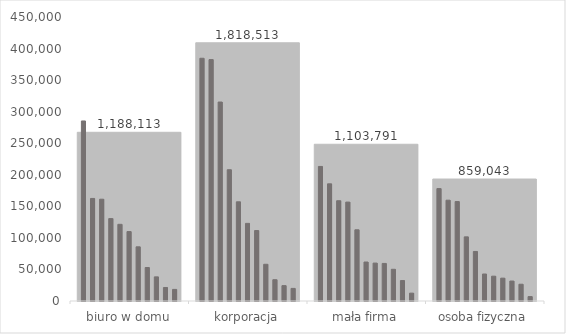
| Category | Total |
|---|---|
| biuro w domu | 1188113.347 |
| korporacja | 1818513.147 |
| mała firma | 1103791.326 |
| osoba fizyczna | 859042.824 |